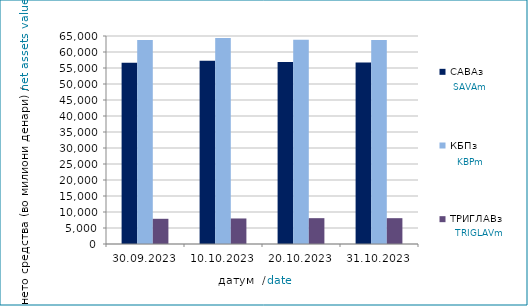
| Category | САВАз | КБПз | ТРИГЛАВз |
|---|---|---|---|
| 2023-09-30 | 56644.997 | 63717.706 | 7875.056 |
| 2023-10-10 | 57242.584 | 64384.842 | 7977.157 |
| 2023-10-20 | 56837.896 | 63839.411 | 8073.437 |
| 2023-10-31 | 56697.716 | 63779.816 | 8068.567 |